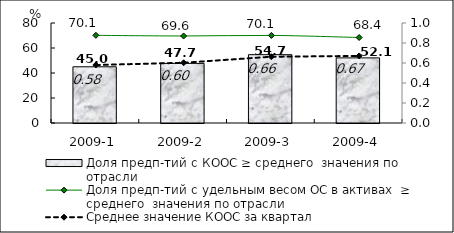
| Category | Доля предп-тий с КООС ≥ среднего  значения по отрасли |
|---|---|
| 2009-1 | 44.97 |
| 2009-2 | 47.71 |
| 2009-3 | 54.66 |
| 2009-4 | 52.1 |